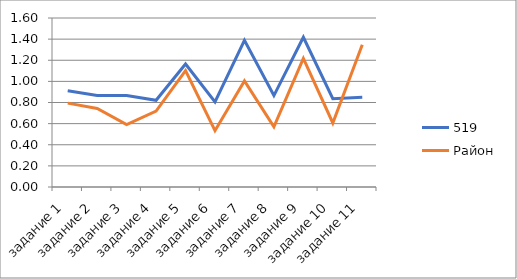
| Category | 519 | Район  |
|---|---|---|
| задание 1 | 0.91 | 0.794 |
| задание 2 | 0.866 | 0.743 |
| задание 3 | 0.866 | 0.59 |
| задание 4 | 0.821 | 0.719 |
| задание 5 | 1.164 | 1.101 |
| задание 6 | 0.806 | 0.533 |
| задание 7 | 1.388 | 1.005 |
| задание 8 | 0.866 | 0.569 |
| задание 9 | 1.418 | 1.217 |
| задание 10 | 0.836 | 0.606 |
| задание 11 | 0.851 | 1.346 |